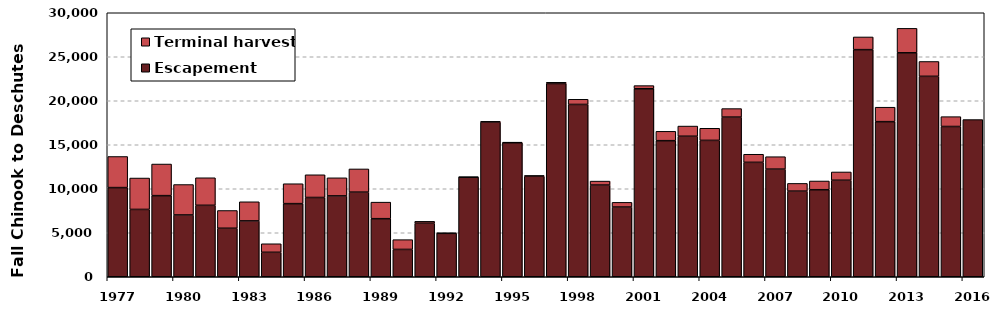
| Category | Escapement | Terminal harvest |
|---|---|---|
| 1977.0 | 10133 | 3533 |
| 1978.0 | 7651 | 3568 |
| 1979.0 | 9217 | 3592 |
| 1980.0 | 7022 | 3458 |
| 1981.0 | 8118 | 3131 |
| 1982.0 | 5513 | 2016 |
| 1983.0 | 6346 | 2174 |
| 1984.0 | 2779 | 970 |
| 1985.0 | 8309 | 2261 |
| 1986.0 | 9008 | 2581 |
| 1987.0 | 9187 | 2057 |
| 1988.0 | 9616 | 2636 |
| 1989.0 | 6599 | 1880 |
| 1990.0 | 3106 | 1110 |
| 1991.0 | 6085 | 213 |
| 1992.0 | 4933 | 41 |
| 1993.0 | 11316 | 11 |
| 1994.0 | 17579 | 77 |
| 1995.0 | 15233 | 55 |
| 1996.0 | 11420 | 84 |
| 1997.0 | 21959 | 140 |
| 1998.0 | 19582 | 585 |
| 1999.0 | 10422 | 449 |
| 2000.0 | 7922 | 534 |
| 2001.0 | 21362 | 361 |
| 2002.0 | 15464 | 1064 |
| 2003.0 | 15968 | 1156 |
| 2004.0 | 15498 | 1377 |
| 2005.0 | 18142 | 970 |
| 2006.0 | 13001 | 920 |
| 2007.0 | 12229 | 1413 |
| 2008.0 | 9728.59 | 879 |
| 2009.0 | 9890.5 | 991 |
| 2010.0 | 10970 | 937 |
| 2011.0 | 25809 | 1442 |
| 2012.0 | 17624.429 | 1644 |
| 2013.0 | 25448 | 2780.08 |
| 2014.0 | 22776 | 1687 |
| 2015.0 | 17074 | 1120 |
| 2016.0 | 17862 | 0 |